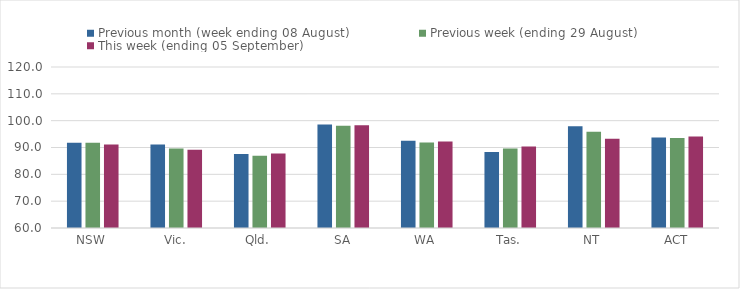
| Category | Previous month (week ending 08 August) | Previous week (ending 29 August) | This week (ending 05 September) |
|---|---|---|---|
| NSW | 91.8 | 91.77 | 91.16 |
| Vic. | 91.16 | 89.67 | 89.19 |
| Qld. | 87.54 | 86.97 | 87.78 |
| SA | 98.53 | 98.06 | 98.28 |
| WA | 92.55 | 91.87 | 92.21 |
| Tas. | 88.34 | 89.67 | 90.38 |
| NT | 97.95 | 95.9 | 93.22 |
| ACT | 93.77 | 93.54 | 94.1 |